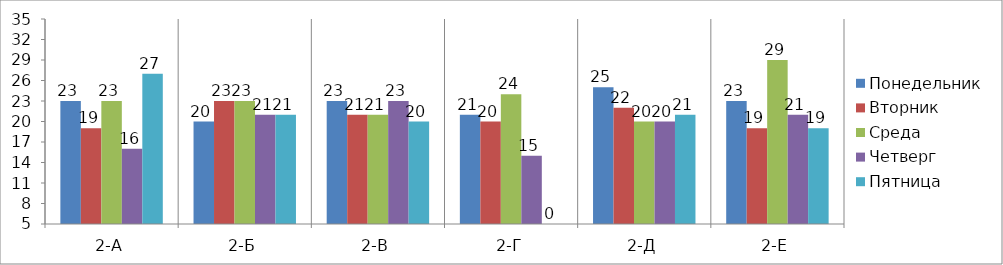
| Category | Понедельник | Вторник | Среда | Четверг | Пятница |
|---|---|---|---|---|---|
| 2-А | 23 | 19 | 23 | 16 | 27 |
| 2-Б | 20 | 23 | 23 | 21 | 21 |
| 2-В | 23 | 21 | 21 | 23 | 20 |
| 2-Г | 21 | 20 | 24 | 15 | 0 |
| 2-Д | 25 | 22 | 20 | 20 | 21 |
| 2-Е | 23 | 19 | 29 | 21 | 19 |